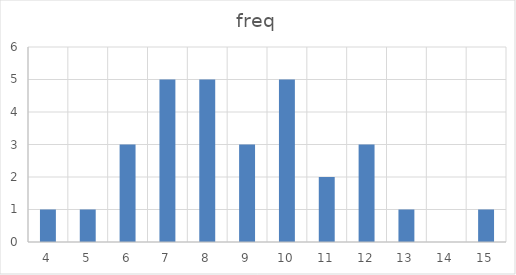
| Category | freq |
|---|---|
| 4.0 | 1 |
| 5.0 | 1 |
| 6.0 | 3 |
| 7.0 | 5 |
| 8.0 | 5 |
| 9.0 | 3 |
| 10.0 | 5 |
| 11.0 | 2 |
| 12.0 | 3 |
| 13.0 | 1 |
| 14.0 | 0 |
| 15.0 | 1 |